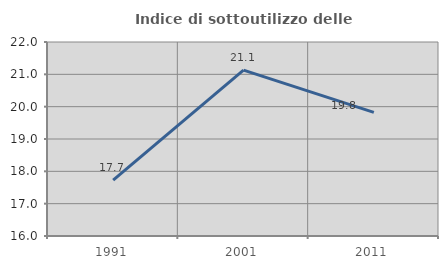
| Category | Indice di sottoutilizzo delle abitazioni  |
|---|---|
| 1991.0 | 17.73 |
| 2001.0 | 21.128 |
| 2011.0 | 19.825 |